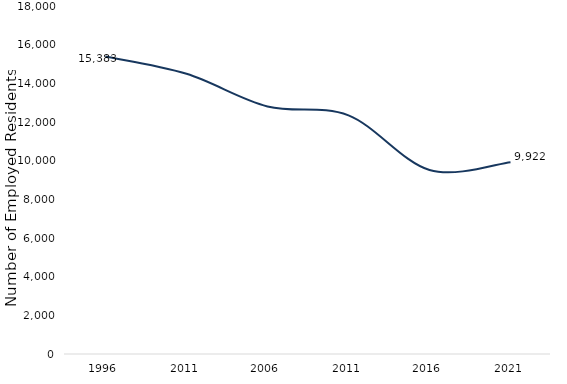
| Category | Employment |
|---|---|
| 1996.0 | 15383 |
| 2011.0 | 14493 |
| 2006.0 | 12805 |
| 2011.0 | 12345 |
| 2016.0 | 9517 |
| 2021.0 | 9922 |